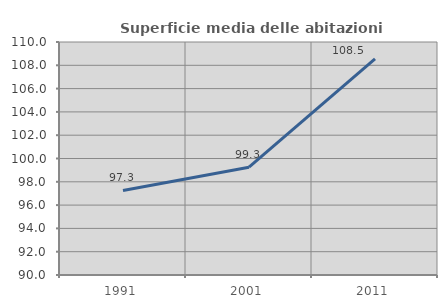
| Category | Superficie media delle abitazioni occupate |
|---|---|
| 1991.0 | 97.259 |
| 2001.0 | 99.253 |
| 2011.0 | 108.547 |